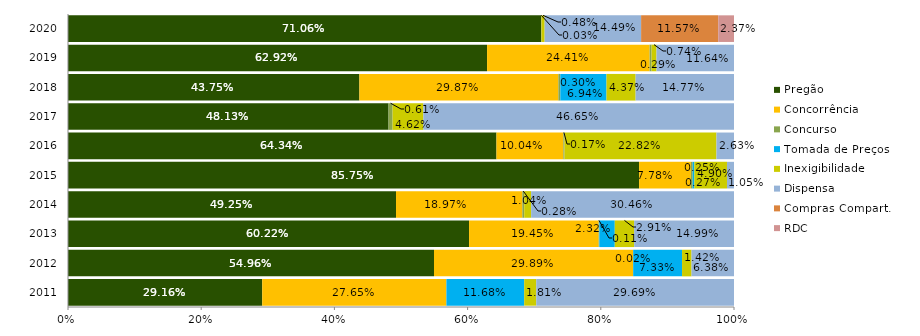
| Category | Pregão | Concorrência | Concurso | Tomada de Preços | Inexigibilidade | Dispensa | Compras Compart. | RDC |
|---|---|---|---|---|---|---|---|---|
| 2011.0 | 0.292 | 0.277 | 0 | 0.117 | 0.018 | 0.297 | 0 | 0 |
| 2012.0 | 0.55 | 0.299 | 0 | 0.073 | 0.014 | 0.064 | 0 | 0 |
| 2013.0 | 0.602 | 0.195 | 0.001 | 0.023 | 0.029 | 0.15 | 0 | 0 |
| 2014.0 | 0.493 | 0.19 | 0.003 | 0 | 0.01 | 0.305 | 0 | 0 |
| 2015.0 | 0.858 | 0.078 | 0.003 | 0.002 | 0.049 | 0.011 | 0 | 0 |
| 2016.0 | 0.643 | 0.1 | 0.002 | 0 | 0.228 | 0.026 | 0 | 0 |
| 2017.0 | 0.481 | 0 | 0.006 | 0 | 0.046 | 0.466 | 0 | 0 |
| 2018.0 | 0.438 | 0.299 | 0.003 | 0.069 | 0.044 | 0.148 | 0 | 0 |
| 2019.0 | 0.629 | 0.244 | 0.003 | 0 | 0.007 | 0.116 | 0 | 0 |
| 2020.0 | 0.711 | 0 | 0 | 0 | 0.005 | 0.145 | 0.116 | 0.024 |